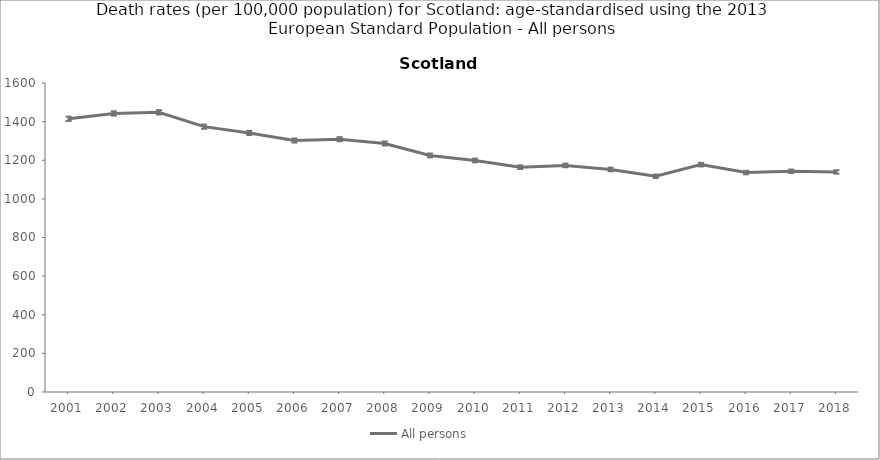
| Category | All persons |
|---|---|
| 2001.0 | 1414.6 |
| 2002.0 | 1442.2 |
| 2003.0 | 1448.3 |
| 2004.0 | 1374.1 |
| 2005.0 | 1341.5 |
| 2006.0 | 1302.1 |
| 2007.0 | 1309 |
| 2008.0 | 1286.8 |
| 2009.0 | 1224.9 |
| 2010.0 | 1198.8 |
| 2011.0 | 1164.2 |
| 2012.0 | 1173.3 |
| 2013.0 | 1152.3 |
| 2014.0 | 1116.9 |
| 2015.0 | 1177.3 |
| 2016.0 | 1136.4 |
| 2017.0 | 1142.9 |
| 2018.0 | 1139.5 |